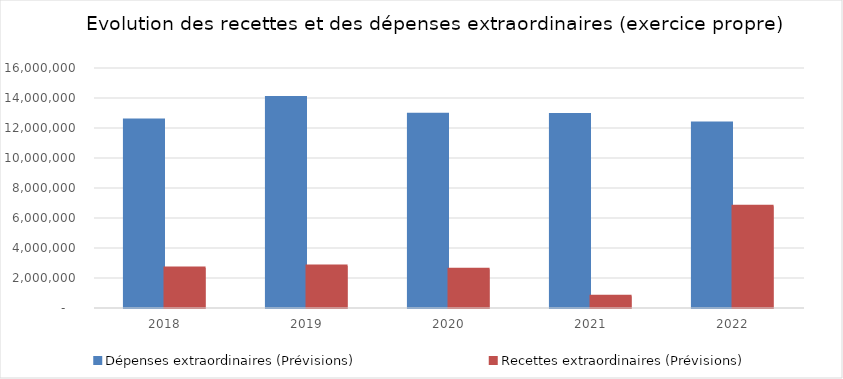
| Category | Dépenses extraordinaires (Prévisions) | Recettes extraordinaires (Prévisions) |
|---|---|---|
| 2018.0 | 12529313.94 | 2662775 |
| 2019.0 | 14031213.94 | 2800530.96 |
| 2020.0 | 12916552.7 | 2583800 |
| 2021.0 | 12903052.7 | 789500 |
| 2022.0 | 12334052.7 | 6790500 |